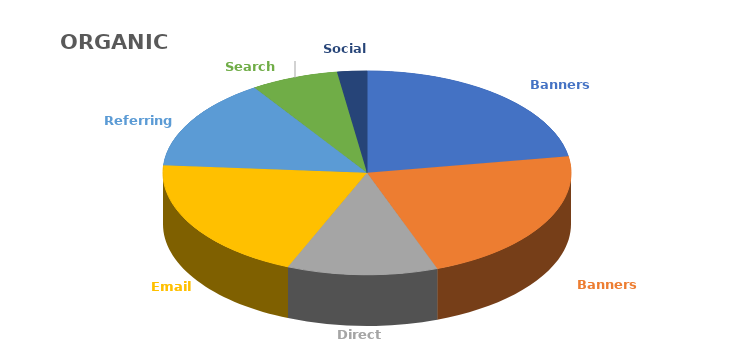
| Category | Series 1 |
|---|---|
| Banners (Partner) | 23966 |
| Banners (Website) | 23604 |
| Direct Traffic | 12766 |
| Email | 21274 |
| Referring Domains | 15556 |
| Search (Org) | 7434 |
| Social (Org) | 2517 |